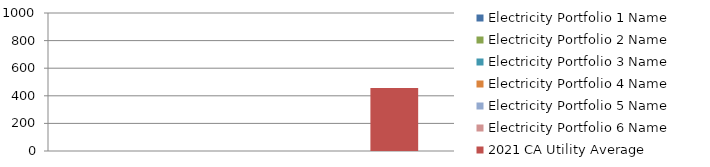
| Category | Electricity Portfolio 1 Name | Electricity Portfolio 2 Name | Electricity Portfolio 3 Name | Electricity Portfolio 4 Name | Electricity Portfolio 5 Name | Electricity Portfolio 6 Name | 2021 CA Utility Average |
|---|---|---|---|---|---|---|---|
| 0 | 0 | 0 | 0 | 0 | 0 | 0 | 456 |